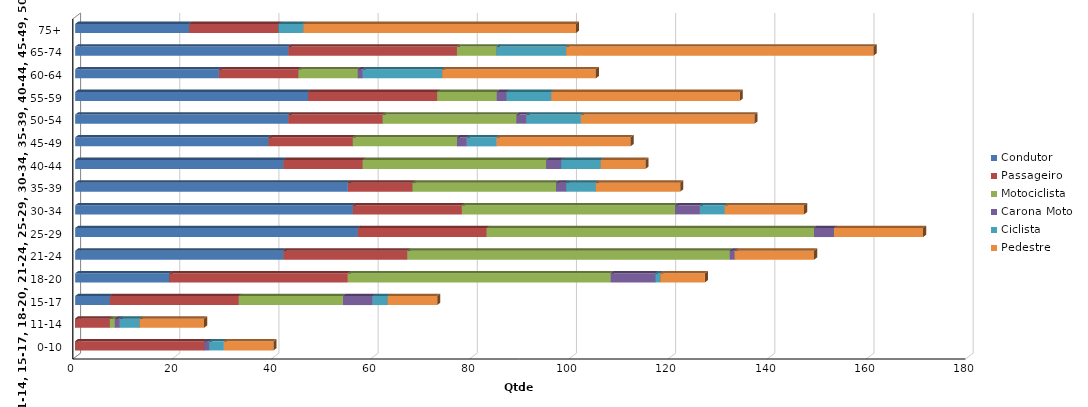
| Category | Condutor | Passageiro | Motociclista | Carona Moto | Ciclista | Pedestre |
|---|---|---|---|---|---|---|
| 0-10 | 0 | 26 | 0 | 1 | 3 | 10 |
| 11-14 | 0 | 7 | 1 | 1 | 4 | 13 |
| 15-17 | 7 | 26 | 21 | 6 | 3 | 10 |
| 18-20 | 19 | 36 | 53 | 9 | 1 | 9 |
| 21-24 | 42 | 25 | 65 | 1 | 0 | 16 |
| 25-29 | 57 | 26 | 66 | 4 | 0 | 18 |
| 30-34 | 56 | 22 | 43 | 5 | 5 | 16 |
| 35-39 | 55 | 13 | 29 | 2 | 6 | 17 |
| 40-44 | 42 | 16 | 37 | 3 | 8 | 9 |
| 45-49 | 39 | 17 | 21 | 2 | 6 | 27 |
| 50-54 | 43 | 19 | 27 | 2 | 11 | 35 |
| 55-59 | 47 | 26 | 12 | 2 | 9 | 38 |
| 60-64 | 29 | 16 | 12 | 1 | 16 | 31 |
| 65-74 | 43 | 34 | 8 | 0 | 14 | 62 |
| 75+ | 23 | 18 | 0 | 0 | 5 | 55 |